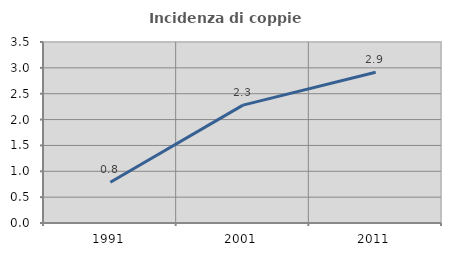
| Category | Incidenza di coppie miste |
|---|---|
| 1991.0 | 0.789 |
| 2001.0 | 2.279 |
| 2011.0 | 2.914 |